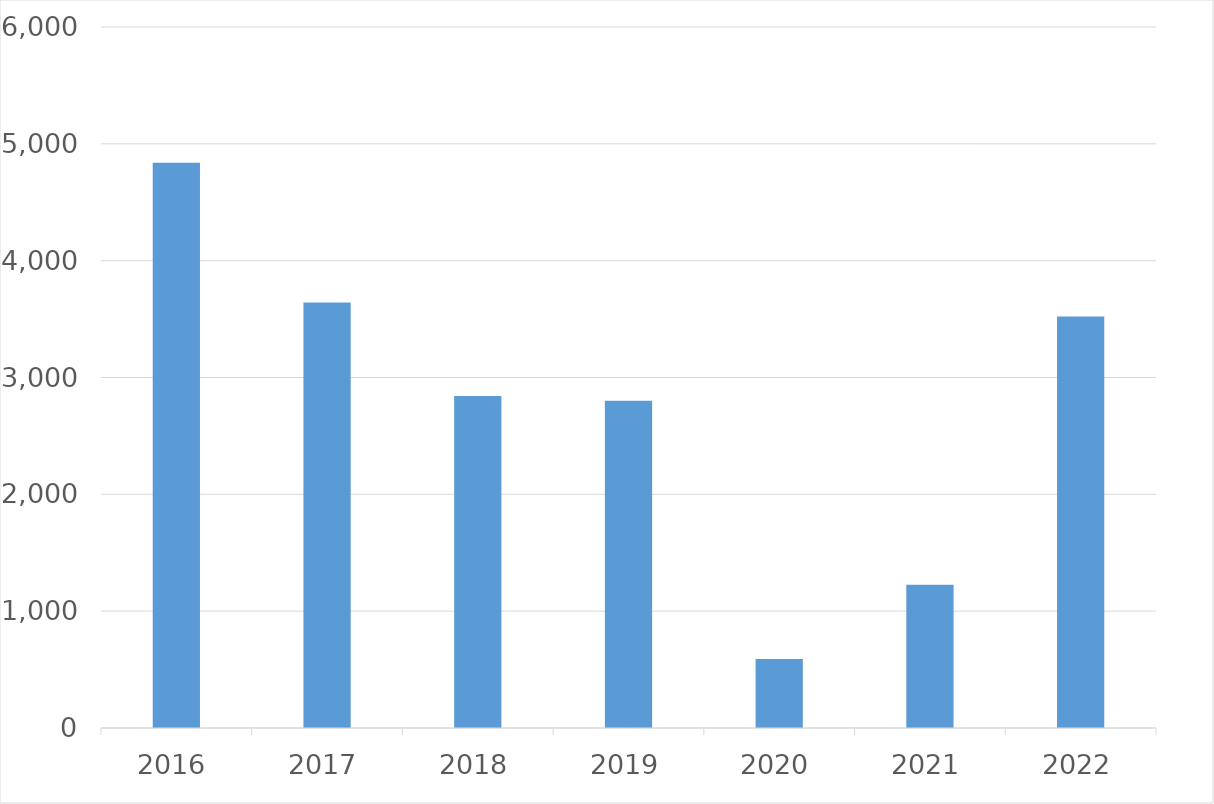
| Category | Series 0 |
|---|---|
| 2016 | 4839 |
| 2017 | 3643 |
| 2018 | 2841 |
| 2019 | 2801 |
| 2020 | 591 |
| 2021 | 1227 |
| 2022 | 3523 |